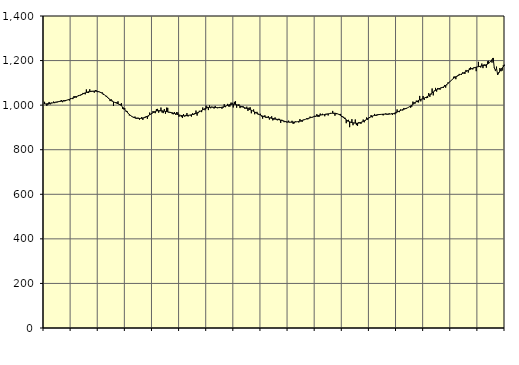
| Category | Piggar | Series 1 |
|---|---|---|
| nan | 1014.9 | 1005.1 |
| 87.0 | 1004.9 | 1005.44 |
| 87.0 | 996.7 | 1005.91 |
| 87.0 | 1002 | 1006.46 |
| 87.0 | 1014.3 | 1007.18 |
| 87.0 | 1003.4 | 1007.96 |
| 87.0 | 1011.2 | 1008.91 |
| 87.0 | 1009.4 | 1009.91 |
| 87.0 | 1016.1 | 1011.02 |
| 87.0 | 1008.8 | 1012.17 |
| 87.0 | 1014.6 | 1013.29 |
| 87.0 | 1012.2 | 1014.32 |
| nan | 1014.2 | 1015.24 |
| 88.0 | 1014.5 | 1016.06 |
| 88.0 | 1020 | 1016.87 |
| 88.0 | 1022.8 | 1017.7 |
| 88.0 | 1013.2 | 1018.5 |
| 88.0 | 1023 | 1019.33 |
| 88.0 | 1017.1 | 1020.29 |
| 88.0 | 1020.8 | 1021.38 |
| 88.0 | 1022.7 | 1022.66 |
| 88.0 | 1026.2 | 1024.17 |
| 88.0 | 1020.7 | 1025.92 |
| 88.0 | 1030.4 | 1027.85 |
| nan | 1030.3 | 1029.92 |
| 89.0 | 1027.1 | 1032.06 |
| 89.0 | 1040.3 | 1034.14 |
| 89.0 | 1040.3 | 1036.12 |
| 89.0 | 1033.2 | 1038.07 |
| 89.0 | 1039.3 | 1039.99 |
| 89.0 | 1045.2 | 1041.93 |
| 89.0 | 1042.8 | 1043.95 |
| 89.0 | 1043.2 | 1046.09 |
| 89.0 | 1045.9 | 1048.35 |
| 89.0 | 1054.8 | 1050.69 |
| 89.0 | 1050.7 | 1052.98 |
| nan | 1048.5 | 1055.15 |
| 90.0 | 1070.4 | 1057.11 |
| 90.0 | 1055.6 | 1058.79 |
| 90.0 | 1054.4 | 1060.13 |
| 90.0 | 1071.2 | 1061.16 |
| 90.0 | 1058.8 | 1061.94 |
| 90.0 | 1061.1 | 1062.47 |
| 90.0 | 1061 | 1062.78 |
| 90.0 | 1056.1 | 1062.88 |
| 90.0 | 1067.8 | 1062.72 |
| 90.0 | 1065.9 | 1062.25 |
| 90.0 | 1058.3 | 1061.42 |
| nan | 1062.3 | 1060.18 |
| 91.0 | 1058.8 | 1058.41 |
| 91.0 | 1056.3 | 1056.13 |
| 91.0 | 1057.3 | 1053.38 |
| 91.0 | 1045.7 | 1050.09 |
| 91.0 | 1046.5 | 1046.29 |
| 91.0 | 1040.2 | 1042.08 |
| 91.0 | 1041.7 | 1037.6 |
| 91.0 | 1034.7 | 1033.02 |
| 91.0 | 1029.7 | 1028.49 |
| 91.0 | 1018.2 | 1024.22 |
| 91.0 | 1026.2 | 1020.47 |
| nan | 1020 | 1017.29 |
| 92.0 | 996.1 | 1014.68 |
| 92.0 | 1013.3 | 1012.52 |
| 92.0 | 1013.7 | 1010.59 |
| 92.0 | 1012.7 | 1008.72 |
| 92.0 | 1017.1 | 1006.65 |
| 92.0 | 1002.4 | 1004.14 |
| 92.0 | 1003.9 | 1000.95 |
| 92.0 | 1008.8 | 996.98 |
| 92.0 | 983.9 | 992.22 |
| 92.0 | 981.1 | 986.79 |
| 92.0 | 986.2 | 980.91 |
| nan | 971.6 | 974.83 |
| 93.0 | 973.2 | 968.92 |
| 93.0 | 965 | 963.45 |
| 93.0 | 953.6 | 958.47 |
| 93.0 | 952.7 | 954.13 |
| 93.0 | 949.2 | 950.46 |
| 93.0 | 946.3 | 947.41 |
| 93.0 | 942.5 | 944.96 |
| 93.0 | 948.8 | 943.08 |
| 93.0 | 938.7 | 941.77 |
| 93.0 | 943.4 | 940.93 |
| 93.0 | 943.3 | 940.45 |
| nan | 934.8 | 940.26 |
| 94.0 | 941.5 | 940.36 |
| 94.0 | 946.6 | 940.8 |
| 94.0 | 933.8 | 941.7 |
| 94.0 | 944.8 | 943.09 |
| 94.0 | 947.7 | 944.94 |
| 94.0 | 951 | 947.28 |
| 94.0 | 938.4 | 950.1 |
| 94.0 | 949.8 | 953.25 |
| 94.0 | 966.7 | 956.61 |
| 94.0 | 958.1 | 960.13 |
| 94.0 | 961.1 | 963.58 |
| nan | 973.7 | 966.84 |
| 95.0 | 966.6 | 969.75 |
| 95.0 | 963.8 | 972.06 |
| 95.0 | 982.7 | 973.7 |
| 95.0 | 983.2 | 974.71 |
| 95.0 | 966.1 | 975.15 |
| 95.0 | 972.9 | 975.16 |
| 95.0 | 989.2 | 974.91 |
| 95.0 | 966.9 | 974.46 |
| 95.0 | 964.2 | 973.81 |
| 95.0 | 982.7 | 972.95 |
| 95.0 | 961.3 | 971.93 |
| nan | 988.7 | 970.85 |
| 96.0 | 987.9 | 969.78 |
| 96.0 | 966.4 | 968.78 |
| 96.0 | 966.2 | 967.86 |
| 96.0 | 966.1 | 966.83 |
| 96.0 | 959.8 | 965.69 |
| 96.0 | 959.1 | 964.38 |
| 96.0 | 968.9 | 962.8 |
| 96.0 | 957 | 961.01 |
| 96.0 | 969.2 | 959.22 |
| 96.0 | 967.2 | 957.51 |
| 96.0 | 947.9 | 955.98 |
| nan | 955 | 954.7 |
| 97.0 | 947.5 | 953.64 |
| 97.0 | 942.2 | 952.82 |
| 97.0 | 959.9 | 952.3 |
| 97.0 | 948.7 | 952.17 |
| 97.0 | 956.1 | 952.47 |
| 97.0 | 964.4 | 953.11 |
| 97.0 | 949.1 | 953.96 |
| 97.0 | 955.4 | 954.94 |
| 97.0 | 953.5 | 955.95 |
| 97.0 | 948.8 | 956.95 |
| 97.0 | 963.5 | 958.1 |
| nan | 955.9 | 959.45 |
| 98.0 | 964.7 | 961.04 |
| 98.0 | 975.7 | 962.98 |
| 98.0 | 953 | 965.22 |
| 98.0 | 964.1 | 967.69 |
| 98.0 | 974.7 | 970.36 |
| 98.0 | 972.4 | 973.13 |
| 98.0 | 968.6 | 975.97 |
| 98.0 | 989.4 | 978.82 |
| 98.0 | 980.9 | 981.59 |
| 98.0 | 977.1 | 984.17 |
| 98.0 | 997.8 | 986.45 |
| nan | 992.6 | 988.27 |
| 99.0 | 977.8 | 989.57 |
| 99.0 | 998.9 | 990.37 |
| 99.0 | 986 | 990.74 |
| 99.0 | 993.1 | 990.76 |
| 99.0 | 992 | 990.48 |
| 99.0 | 984.8 | 989.99 |
| 99.0 | 996.5 | 989.43 |
| 99.0 | 987.4 | 988.97 |
| 99.0 | 986.3 | 988.72 |
| 99.0 | 987.4 | 988.76 |
| 99.0 | 991.9 | 989.07 |
| nan | 989 | 989.71 |
| 0.0 | 983.8 | 990.7 |
| 0.0 | 988.5 | 991.96 |
| 0.0 | 1004.3 | 993.47 |
| 0.0 | 990.8 | 995.2 |
| 0.0 | 998.1 | 997.04 |
| 0.0 | 1005.6 | 998.93 |
| 0.0 | 993.9 | 1000.74 |
| 0.0 | 993.5 | 1002.31 |
| 0.0 | 1011.3 | 1003.5 |
| 0.0 | 1010.7 | 1004.22 |
| 0.0 | 989.6 | 1004.43 |
| nan | 1014.8 | 1004.06 |
| 1.0 | 1017.4 | 1003.21 |
| 1.0 | 988.6 | 1001.9 |
| 1.0 | 1001 | 1000.13 |
| 1.0 | 1004.2 | 998.1 |
| 1.0 | 986.8 | 996.01 |
| 1.0 | 990.9 | 993.95 |
| 1.0 | 995.3 | 992.05 |
| 1.0 | 993.9 | 990.37 |
| 1.0 | 984.6 | 988.8 |
| 1.0 | 984.8 | 987.23 |
| 1.0 | 993.1 | 985.62 |
| nan | 974.1 | 983.85 |
| 2.0 | 988.8 | 981.83 |
| 2.0 | 990.2 | 979.64 |
| 2.0 | 963.5 | 977.35 |
| 2.0 | 975.3 | 974.84 |
| 2.0 | 980.6 | 972.16 |
| 2.0 | 959 | 969.38 |
| 2.0 | 968.6 | 966.48 |
| 2.0 | 969.9 | 963.55 |
| 2.0 | 957.3 | 960.68 |
| 2.0 | 958.9 | 957.93 |
| 2.0 | 961.3 | 955.37 |
| nan | 949.5 | 953.06 |
| 3.0 | 939.5 | 951.02 |
| 3.0 | 951.7 | 949.21 |
| 3.0 | 954.5 | 947.67 |
| 3.0 | 942.2 | 946.39 |
| 3.0 | 945.3 | 945.23 |
| 3.0 | 951.2 | 944.14 |
| 3.0 | 935.3 | 943.11 |
| 3.0 | 943.9 | 942.04 |
| 3.0 | 950 | 940.98 |
| 3.0 | 931.6 | 939.96 |
| 3.0 | 934.9 | 938.99 |
| nan | 944.9 | 938.06 |
| 4.0 | 934.2 | 937.16 |
| 4.0 | 931.8 | 936.2 |
| 4.0 | 938.7 | 935.1 |
| 4.0 | 938.4 | 933.81 |
| 4.0 | 920.4 | 932.42 |
| 4.0 | 934.4 | 930.97 |
| 4.0 | 931.2 | 929.5 |
| 4.0 | 923.5 | 928.07 |
| 4.0 | 925 | 926.73 |
| 4.0 | 922.7 | 925.58 |
| 4.0 | 922.9 | 924.67 |
| nan | 930.3 | 924 |
| 5.0 | 922.1 | 923.6 |
| 5.0 | 923.7 | 923.47 |
| 5.0 | 929.8 | 923.54 |
| 5.0 | 915.8 | 923.75 |
| 5.0 | 918.4 | 924.06 |
| 5.0 | 927 | 924.52 |
| 5.0 | 925.8 | 925.16 |
| 5.0 | 926.2 | 925.98 |
| 5.0 | 922.1 | 927.03 |
| 5.0 | 937.4 | 928.3 |
| 5.0 | 927.1 | 929.75 |
| nan | 925.3 | 931.32 |
| 6.0 | 934.8 | 932.96 |
| 6.0 | 936.1 | 934.63 |
| 6.0 | 936.1 | 936.35 |
| 6.0 | 941.1 | 938.12 |
| 6.0 | 936.2 | 939.92 |
| 6.0 | 940.7 | 941.65 |
| 6.0 | 948.6 | 943.27 |
| 6.0 | 942.9 | 944.8 |
| 6.0 | 944.6 | 946.31 |
| 6.0 | 946.6 | 947.78 |
| 6.0 | 952.3 | 949.2 |
| nan | 947.4 | 950.63 |
| 7.0 | 959.5 | 952.01 |
| 7.0 | 946.9 | 953.25 |
| 7.0 | 947.9 | 954.32 |
| 7.0 | 962.2 | 955.19 |
| 7.0 | 957.4 | 955.91 |
| 7.0 | 961.2 | 956.58 |
| 7.0 | 957.3 | 957.27 |
| 7.0 | 950.1 | 958.03 |
| 7.0 | 961 | 958.92 |
| 7.0 | 960.8 | 959.9 |
| 7.0 | 953.6 | 960.88 |
| nan | 962.5 | 961.82 |
| 8.0 | 965.1 | 962.69 |
| 8.0 | 962.7 | 963.39 |
| 8.0 | 974.1 | 963.86 |
| 8.0 | 961.2 | 964.02 |
| 8.0 | 952.5 | 963.75 |
| 8.0 | 959.1 | 962.95 |
| 8.0 | 961 | 961.59 |
| 8.0 | 958.7 | 959.68 |
| 8.0 | 960.3 | 957.13 |
| 8.0 | 960.6 | 953.99 |
| 8.0 | 946.9 | 950.4 |
| nan | 949.6 | 946.43 |
| 9.0 | 944.6 | 942.25 |
| 9.0 | 943.1 | 938.13 |
| 9.0 | 918.9 | 934.25 |
| 9.0 | 927.3 | 930.74 |
| 9.0 | 934.1 | 927.77 |
| 9.0 | 901.1 | 925.35 |
| 9.0 | 921.6 | 923.41 |
| 9.0 | 937.1 | 921.88 |
| 9.0 | 909.9 | 920.72 |
| 9.0 | 920.8 | 919.8 |
| 9.0 | 935.6 | 919.15 |
| nan | 910.4 | 918.84 |
| 10.0 | 907.2 | 918.9 |
| 10.0 | 923.2 | 919.38 |
| 10.0 | 923.4 | 920.42 |
| 10.0 | 915.9 | 922.09 |
| 10.0 | 925.3 | 924.27 |
| 10.0 | 935.3 | 926.92 |
| 10.0 | 923 | 929.99 |
| 10.0 | 931.2 | 933.25 |
| 10.0 | 944.7 | 936.56 |
| 10.0 | 934.1 | 939.84 |
| 10.0 | 941.3 | 942.9 |
| nan | 946.6 | 945.71 |
| 11.0 | 955.6 | 948.3 |
| 11.0 | 944.8 | 950.59 |
| 11.0 | 953 | 952.47 |
| 11.0 | 960.6 | 954.01 |
| 11.0 | 952.6 | 955.27 |
| 11.0 | 952.4 | 956.25 |
| 11.0 | 959.3 | 957.01 |
| 11.0 | 956.7 | 957.64 |
| 11.0 | 959.3 | 958.18 |
| 11.0 | 958.5 | 958.64 |
| 11.0 | 955 | 959.08 |
| nan | 954.6 | 959.46 |
| 12.0 | 960.4 | 959.68 |
| 12.0 | 962.9 | 959.75 |
| 12.0 | 957.3 | 959.77 |
| 12.0 | 957.5 | 959.77 |
| 12.0 | 963.4 | 959.84 |
| 12.0 | 960.1 | 960.13 |
| 12.0 | 962.7 | 960.71 |
| 12.0 | 956.1 | 961.61 |
| 12.0 | 964.1 | 962.9 |
| 12.0 | 959 | 964.58 |
| 12.0 | 963.3 | 966.58 |
| nan | 980.8 | 968.83 |
| 13.0 | 969.1 | 971.21 |
| 13.0 | 968.5 | 973.64 |
| 13.0 | 980.6 | 975.94 |
| 13.0 | 978.6 | 978.02 |
| 13.0 | 976.1 | 979.89 |
| 13.0 | 987.3 | 981.6 |
| 13.0 | 984.5 | 983.33 |
| 13.0 | 982.6 | 985.29 |
| 13.0 | 987.6 | 987.53 |
| 13.0 | 990.7 | 990.14 |
| 13.0 | 992.2 | 993.16 |
| nan | 988.5 | 996.48 |
| 14.0 | 992.9 | 1000.06 |
| 14.0 | 1015.9 | 1003.86 |
| 14.0 | 1013.1 | 1007.76 |
| 14.0 | 1007.4 | 1011.6 |
| 14.0 | 1020.3 | 1015.19 |
| 14.0 | 1013.5 | 1018.43 |
| 14.0 | 1012.1 | 1021.26 |
| 14.0 | 1041.4 | 1023.63 |
| 14.0 | 1017 | 1025.68 |
| 14.0 | 1026.6 | 1027.57 |
| 14.0 | 1041.1 | 1029.41 |
| nan | 1023.2 | 1031.45 |
| 15.0 | 1036.2 | 1033.79 |
| 15.0 | 1031.5 | 1036.47 |
| 15.0 | 1032.2 | 1039.53 |
| 15.0 | 1054 | 1043.02 |
| 15.0 | 1037.2 | 1046.88 |
| 15.0 | 1046.8 | 1051 |
| 15.0 | 1074.7 | 1055.19 |
| 15.0 | 1043.8 | 1059.25 |
| 15.0 | 1065.5 | 1063 |
| 15.0 | 1077.4 | 1066.34 |
| 15.0 | 1060.9 | 1069.16 |
| nan | 1077 | 1071.5 |
| 16.0 | 1075.8 | 1073.53 |
| 16.0 | 1069 | 1075.38 |
| 16.0 | 1079.7 | 1077.24 |
| 16.0 | 1081.3 | 1079.28 |
| 16.0 | 1077.5 | 1081.73 |
| 16.0 | 1090.5 | 1084.79 |
| 16.0 | 1078.6 | 1088.42 |
| 16.0 | 1089.2 | 1092.54 |
| 16.0 | 1101.8 | 1097.11 |
| 16.0 | 1100.8 | 1101.91 |
| 16.0 | 1105.6 | 1106.77 |
| nan | 1112.5 | 1111.54 |
| 17.0 | 1117.4 | 1116.09 |
| 17.0 | 1127.4 | 1120.27 |
| 17.0 | 1128.7 | 1124.02 |
| 17.0 | 1116.4 | 1127.33 |
| 17.0 | 1128.3 | 1130.24 |
| 17.0 | 1135 | 1132.82 |
| 17.0 | 1140.1 | 1135.17 |
| 17.0 | 1137.4 | 1137.51 |
| 17.0 | 1135.9 | 1139.9 |
| 17.0 | 1147.1 | 1142.42 |
| 17.0 | 1142.5 | 1145.19 |
| nan | 1139.7 | 1148.14 |
| 18.0 | 1157.9 | 1151.04 |
| 18.0 | 1154.3 | 1153.79 |
| 18.0 | 1146.2 | 1156.38 |
| 18.0 | 1165.3 | 1158.82 |
| 18.0 | 1169.1 | 1161.16 |
| 18.0 | 1166.2 | 1163.32 |
| 18.0 | 1160.1 | 1165.3 |
| 18.0 | 1169.4 | 1167.16 |
| 18.0 | 1168.4 | 1168.86 |
| 18.0 | 1152.4 | 1170.31 |
| 18.0 | 1172.5 | 1171.54 |
| nan | 1194.3 | 1172.65 |
| 19.0 | 1172 | 1173.76 |
| 19.0 | 1168.9 | 1174.92 |
| 19.0 | 1186.6 | 1176.13 |
| 19.0 | 1166.1 | 1177.4 |
| 19.0 | 1183.2 | 1178.65 |
| 19.0 | 1176.2 | 1180.02 |
| 19.0 | 1168 | 1181.73 |
| 19.0 | 1196.4 | 1184.03 |
| 19.0 | 1198.8 | 1187.22 |
| 19.0 | 1191.4 | 1191.62 |
| 19.0 | 1195.1 | 1197.26 |
| nan | 1190.8 | 1203.96 |
| 20.0 | 1202.3 | 1211.61 |
| 20.0 | 1169.2 | 1167.75 |
| 20.0 | 1152.8 | 1156.31 |
| 20.0 | 1172.8 | 1165.59 |
| 20.0 | 1141.5 | 1136.19 |
| 20.0 | 1148.4 | 1145.05 |
| 20.0 | 1166.6 | 1153.29 |
| 20.0 | 1152.1 | 1160.65 |
| 20.0 | 1154.9 | 1166.97 |
| 20.0 | 1178.9 | 1172.39 |
| 20.0 | 1181.3 | 1177.12 |